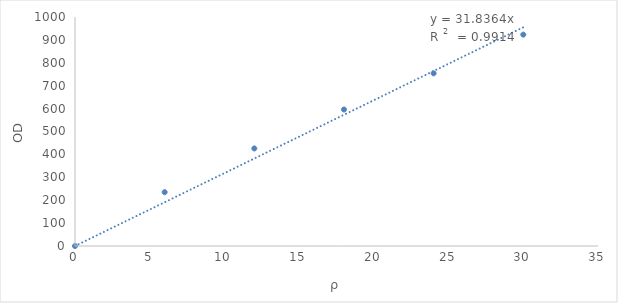
| Category | Series 0 |
|---|---|
| 0.0 | 0 |
| 6.0 | 235 |
| 12.0 | 426 |
| 18.0 | 596 |
| 24.0 | 754 |
| 30.0 | 923 |